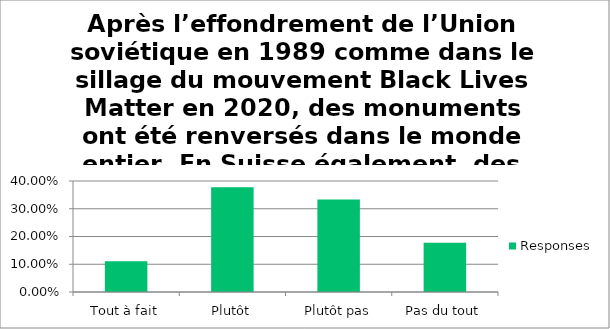
| Category | Responses |
|---|---|
| Tout à fait | 0.111 |
| Plutôt | 0.378 |
| Plutôt pas | 0.333 |
| Pas du tout | 0.178 |